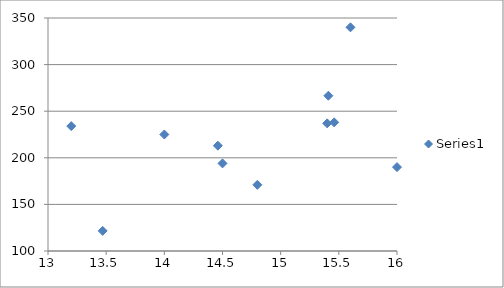
| Category | Series 0 |
|---|---|
| 14.0 | 225 |
| 15.6 | 340 |
| 14.5 | 194 |
| 14.46 | 213 |
| 15.41 | 266.6 |
| 15.46 | 238 |
| 14.8 | 171 |
| 16.0 | 190 |
| 15.4 | 237 |
| 13.47 | 121.58 |
| 13.2 | 234 |